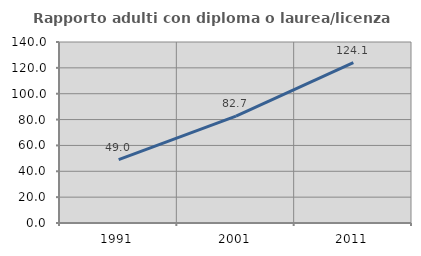
| Category | Rapporto adulti con diploma o laurea/licenza media  |
|---|---|
| 1991.0 | 48.951 |
| 2001.0 | 82.653 |
| 2011.0 | 124.113 |